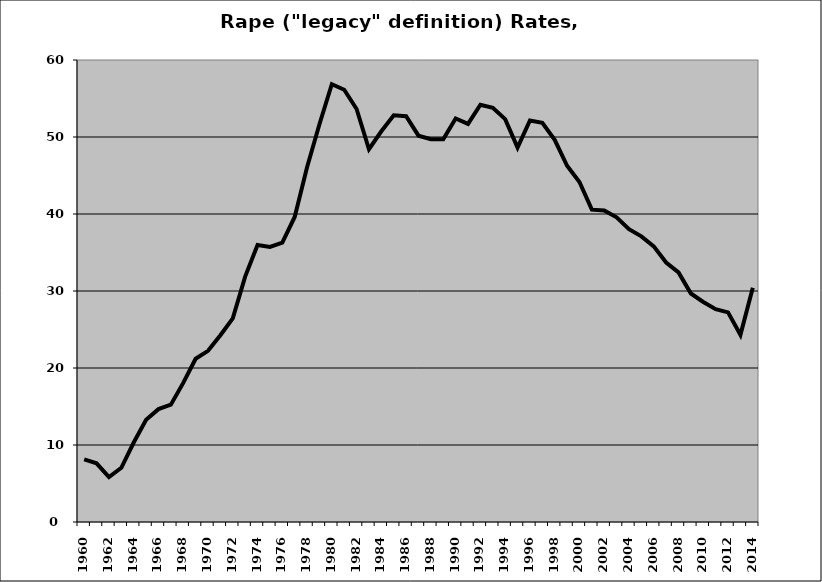
| Category | Rape |
|---|---|
| 1960.0 | 8.139 |
| 1961.0 | 7.622 |
| 1962.0 | 5.825 |
| 1963.0 | 7.042 |
| 1964.0 | 10.324 |
| 1965.0 | 13.282 |
| 1966.0 | 14.661 |
| 1967.0 | 15.229 |
| 1968.0 | 18.068 |
| 1969.0 | 21.199 |
| 1970.0 | 22.226 |
| 1971.0 | 24.258 |
| 1972.0 | 26.45 |
| 1973.0 | 31.87 |
| 1974.0 | 35.97 |
| 1975.0 | 35.731 |
| 1976.0 | 36.278 |
| 1977.0 | 39.612 |
| 1978.0 | 46.079 |
| 1979.0 | 51.648 |
| 1980.0 | 56.851 |
| 1981.0 | 56.138 |
| 1982.0 | 53.639 |
| 1983.0 | 48.408 |
| 1984.0 | 50.747 |
| 1985.0 | 52.824 |
| 1986.0 | 52.694 |
| 1987.0 | 50.171 |
| 1988.0 | 49.721 |
| 1989.0 | 49.712 |
| 1990.0 | 52.412 |
| 1991.0 | 51.706 |
| 1992.0 | 54.196 |
| 1993.0 | 53.798 |
| 1994.0 | 52.326 |
| 1995.0 | 48.616 |
| 1996.0 | 52.139 |
| 1997.0 | 51.856 |
| 1998.0 | 49.638 |
| 1999.0 | 46.257 |
| 2000.0 | 44.155 |
| 2001.0 | 40.56 |
| 2002.0 | 40.457 |
| 2003.0 | 39.572 |
| 2004.0 | 38.032 |
| 2005.0 | 37.1 |
| 2006.0 | 35.793 |
| 2007.0 | 33.696 |
| 2008.0 | 32.414 |
| 2009.0 | 29.674 |
| 2010.0 | 28.578 |
| 2011.0 | 27.633 |
| 2012.0 | 27.225 |
| 2013.0 | 24.311 |
| 2014.0 | 30.417 |